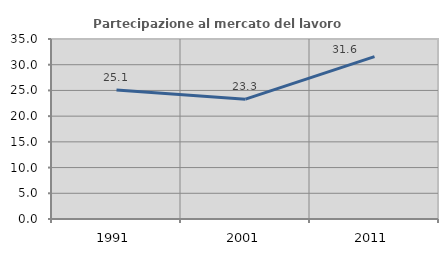
| Category | Partecipazione al mercato del lavoro  femminile |
|---|---|
| 1991.0 | 25.096 |
| 2001.0 | 23.308 |
| 2011.0 | 31.563 |